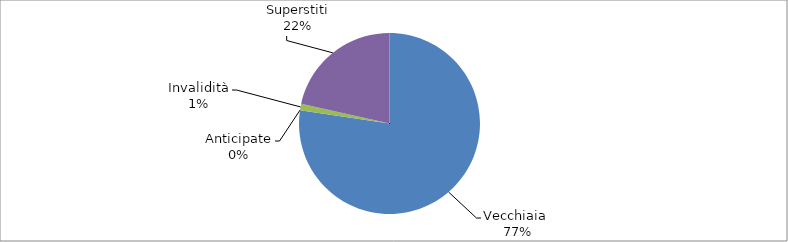
| Category | Series 0 |
|---|---|
| Vecchiaia  | 21964 |
| Anticipate | 0 |
| Invalidità | 325 |
| Superstiti | 6104 |